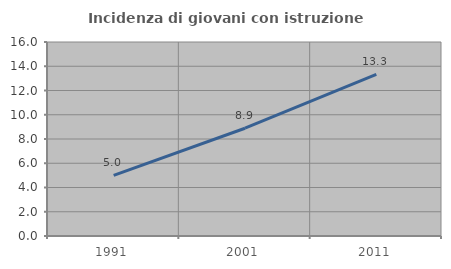
| Category | Incidenza di giovani con istruzione universitaria |
|---|---|
| 1991.0 | 5 |
| 2001.0 | 8.889 |
| 2011.0 | 13.333 |